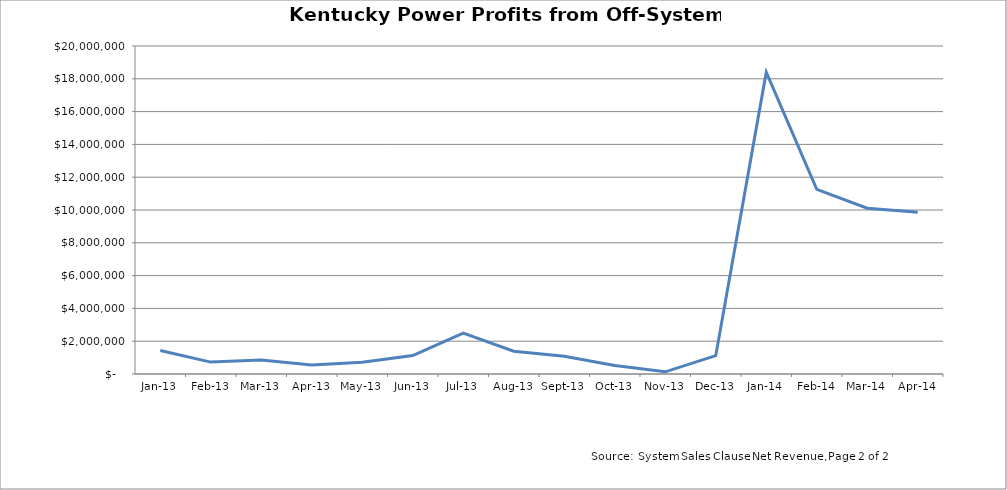
| Category | Series 0 |
|---|---|
| 2013-01-01 | 1428592 |
| 2013-02-01 | 726096 |
| 2013-03-01 | 854404 |
| 2013-04-01 | 551854 |
| 2013-05-01 | 715790 |
| 2013-06-01 | 1123837 |
| 2013-07-01 | 2488684 |
| 2013-08-01 | 1386500 |
| 2013-09-01 | 1081770 |
| 2013-10-01 | 518684 |
| 2013-11-01 | 132976 |
| 2013-12-01 | 1117310 |
| 2014-01-01 | 18397861 |
| 2014-02-01 | 11262678 |
| 2014-03-01 | 10109741 |
| 2014-04-01 | 9865627 |